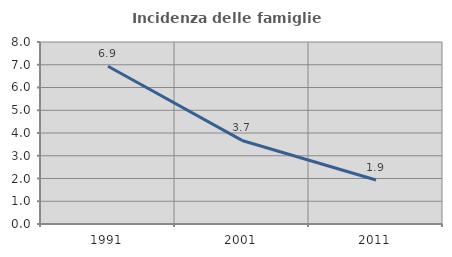
| Category | Incidenza delle famiglie numerose |
|---|---|
| 1991.0 | 6.933 |
| 2001.0 | 3.673 |
| 2011.0 | 1.932 |